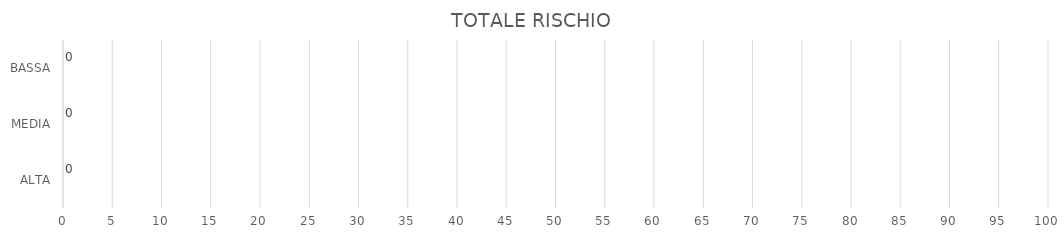
| Category | Series 1 | Series 0 |
|---|---|---|
| ALTA | 0 | 0 |
| MEDIA | 0 | 0 |
| BASSA | 0 | 0 |